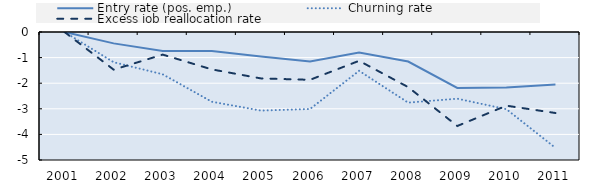
| Category | Entry rate (pos. emp.) | Churning rate | Excess job reallocation rate |
|---|---|---|---|
| 2001.0 | 0 | 0 | 0 |
| 2002.0 | -0.445 | -1.181 | -1.471 |
| 2003.0 | -0.743 | -1.652 | -0.883 |
| 2004.0 | -0.739 | -2.725 | -1.461 |
| 2005.0 | -0.955 | -3.07 | -1.813 |
| 2006.0 | -1.153 | -3.008 | -1.868 |
| 2007.0 | -0.798 | -1.516 | -1.126 |
| 2008.0 | -1.155 | -2.759 | -2.153 |
| 2009.0 | -2.184 | -2.606 | -3.672 |
| 2010.0 | -2.163 | -3.014 | -2.878 |
| 2011.0 | -2.052 | -4.527 | -3.164 |